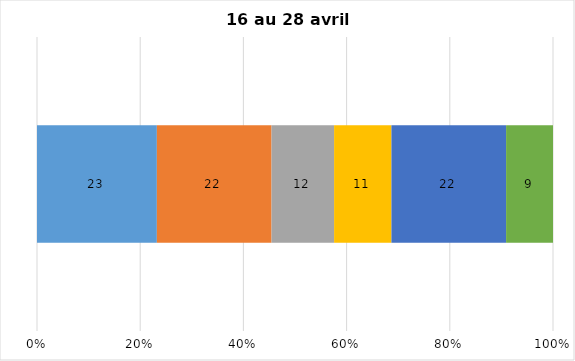
| Category | Plusieurs fois par jour | Une fois par jour | Quelques fois par semaine   | Une fois par semaine ou moins   |  Jamais   |  Je n’utilise pas les médias sociaux |
|---|---|---|---|---|---|---|
| 0 | 23 | 22 | 12 | 11 | 22 | 9 |